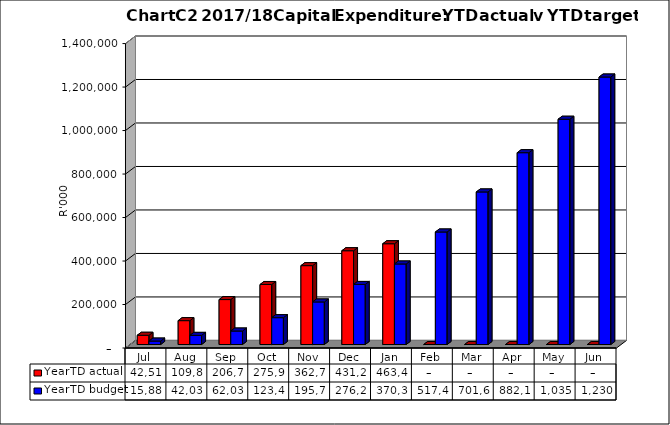
| Category | YearTD actual | YearTD budget |
|---|---|---|
| Jul | 42514077.958 | 15888227.121 |
| Aug | 109819163.669 | 42035272.322 |
| Sep | 206746264.689 | 62035272.322 |
| Oct | 275937386.544 | 123459362.725 |
| Nov | 362773276.763 | 195759882.867 |
| Dec | 431298740.768 | 276210403.008 |
| Jan | 463452466.218 | 370327465.529 |
| Feb | 0 | 517445513.065 |
| Mar | 0 | 701612575.586 |
| Apr | 0 | 882132384.943 |
| May | 0 | 1035958624.038 |
| Jun | 0 | 1230118000 |